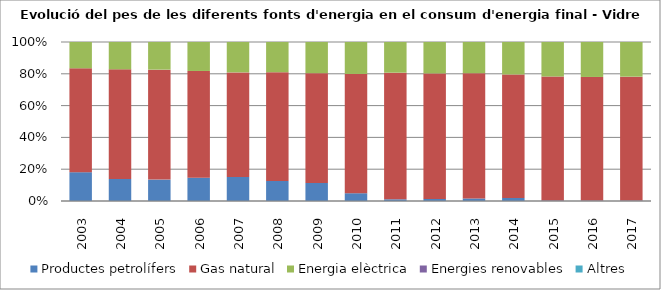
| Category | Productes petrolífers | Gas natural | Energia elèctrica | Energies renovables | Altres |
|---|---|---|---|---|---|
| 2003.0 | 33.2 | 119.8 | 30.3 | 0 | 0 |
| 2004.0 | 24.9 | 123.5 | 30.8 | 0 | 0 |
| 2005.0 | 24.1 | 123.8 | 31.1 | 0 | 0 |
| 2006.0 | 25.8 | 118.3 | 32.1 | 0 | 0 |
| 2007.0 | 24.7 | 107.8 | 31.3 | 0 | 0 |
| 2008.0 | 20 | 108.6 | 30.2 | 0 | 0 |
| 2009.0 | 15.3 | 93 | 26.4 | 0 | 0 |
| 2010.0 | 6.8 | 104.2 | 27.9 | 0 | 0 |
| 2011.0 | 1.6 | 118.5 | 28.7 | 0 | 0 |
| 2012.0 | 1.8 | 107 | 26.8 | 0 | 0 |
| 2013.0 | 2.3 | 114 | 28.4 | 0 | 0 |
| 2014.0 | 2.7 | 110.3 | 29 | 0 | 0 |
| 2015.0 | 0.5 | 100.5 | 28 | 0 | 0 |
| 2016.0 | 0.4 | 99.3 | 28.1 | 0 | 0 |
| 2017.0 | 0.4 | 103.3 | 28.9 | 0 | 0 |